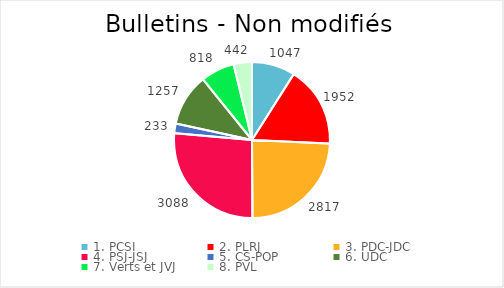
| Category | Series 0 |
|---|---|
| 1. PCSI | 1047 |
| 2. PLRJ | 1952 |
| 3. PDC-JDC | 2817 |
| 4. PSJ-JSJ | 3088 |
| 5. CS-POP | 233 |
| 6. UDC | 1257 |
| 7. Verts et JVJ | 818 |
| 8. PVL | 442 |